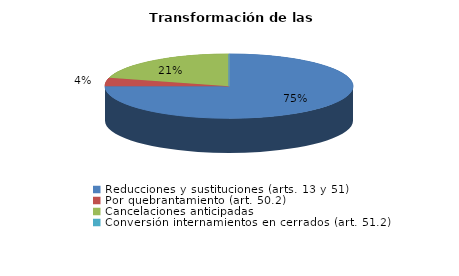
| Category | Series 0 |
|---|---|
| Reducciones y sustituciones (arts. 13 y 51) | 18 |
| Por quebrantamiento (art. 50.2) | 1 |
| Cancelaciones anticipadas | 5 |
| Traslado a Centros Penitenciarios | 0 |
| Conversión internamientos en cerrados (art. 51.2) | 0 |